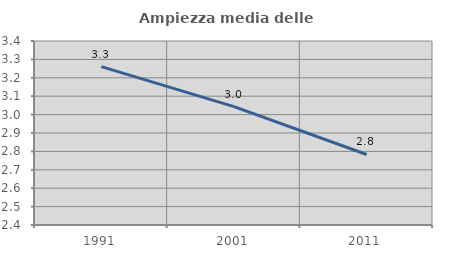
| Category | Ampiezza media delle famiglie |
|---|---|
| 1991.0 | 3.261 |
| 2001.0 | 3.043 |
| 2011.0 | 2.783 |